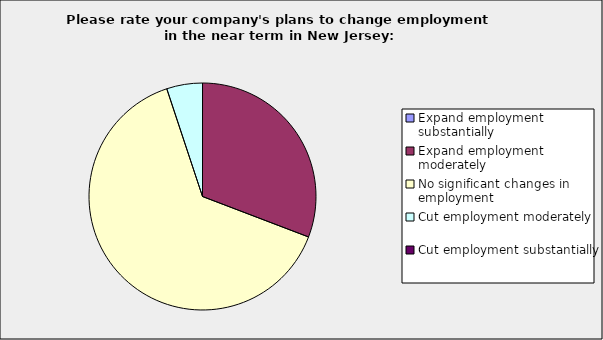
| Category | Series 0 |
|---|---|
| Expand employment substantially | 0 |
| Expand employment moderately | 0.308 |
| No significant changes in employment | 0.641 |
| Cut employment moderately | 0.051 |
| Cut employment substantially | 0 |